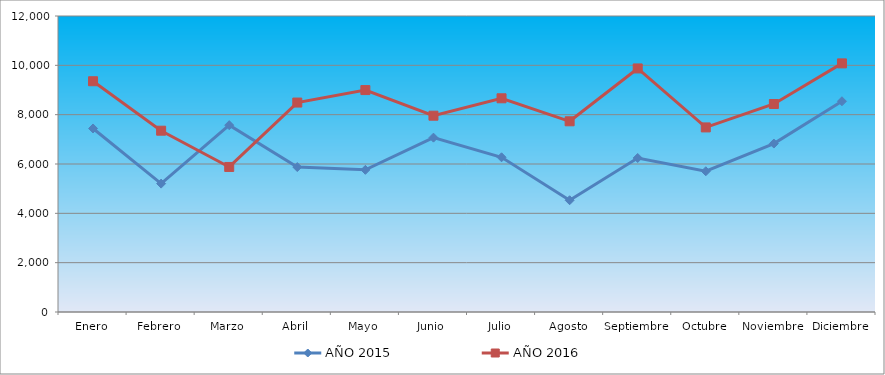
| Category | AÑO 2015 | AÑO 2016 |
|---|---|---|
| Enero | 7440 | 9355 |
| Febrero | 5205 | 7350 |
| Marzo | 7575 | 5880 |
| Abril | 5876 | 8491 |
| Mayo | 5763 | 8997 |
| Junio | 7068 | 7958 |
| Julio | 6272 | 8664 |
| Agosto | 4531 | 7731 |
| Septiembre | 6244 | 9874 |
| Octubre | 5706 | 7483 |
| Noviembre | 6829 | 8433 |
| Diciembre | 8544 | 10079 |